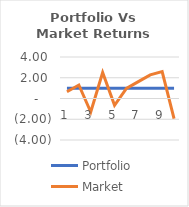
| Category | Portfolio | Market |
|---|---|---|
| 0 | 1 | 0.65 |
| 1 | 1 | 1.3 |
| 2 | 1 | -1.3 |
| 3 | 1 | 2.5 |
| 4 | 1 | -0.65 |
| 5 | 1 | 0.975 |
| 6 | 1 | 1.625 |
| 7 | 1 | 2.275 |
| 8 | 1 | 2.6 |
| 9 | 1 | -1.95 |